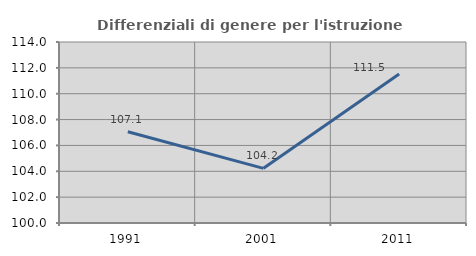
| Category | Differenziali di genere per l'istruzione superiore |
|---|---|
| 1991.0 | 107.053 |
| 2001.0 | 104.227 |
| 2011.0 | 111.517 |